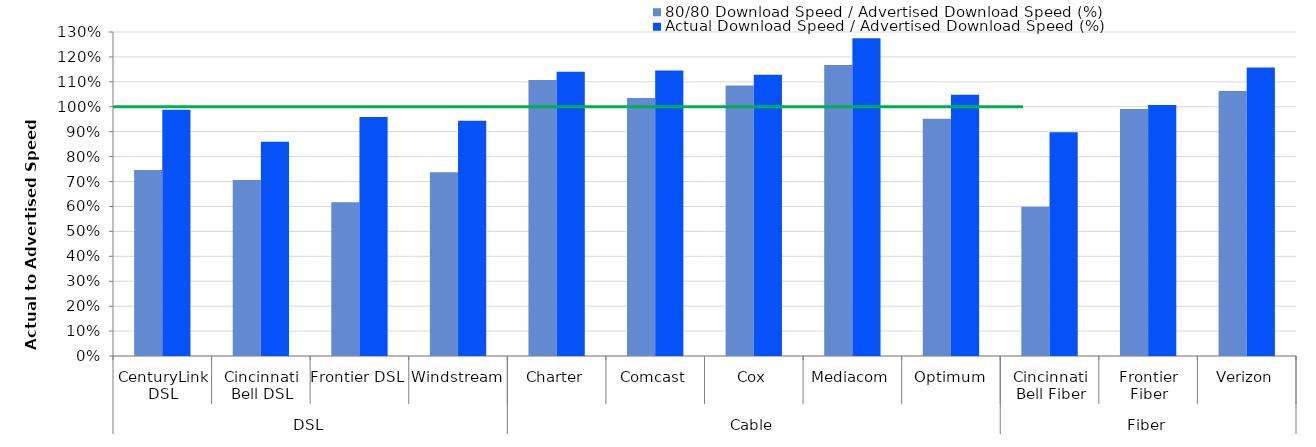
| Category | 80/80 Download Speed / Advertised Download Speed (%) | Actual Download Speed / Advertised Download Speed (%) |
|---|---|---|
| 0 | 0.746 | 0.988 |
| 1 | 0.706 | 0.859 |
| 2 | 0.617 | 0.959 |
| 3 | 0.737 | 0.944 |
| 4 | 1.107 | 1.14 |
| 5 | 1.035 | 1.145 |
| 6 | 1.086 | 1.129 |
| 7 | 1.168 | 1.275 |
| 8 | 0.952 | 1.048 |
| 9 | 0.599 | 0.898 |
| 10 | 0.991 | 1.007 |
| 11 | 1.063 | 1.158 |